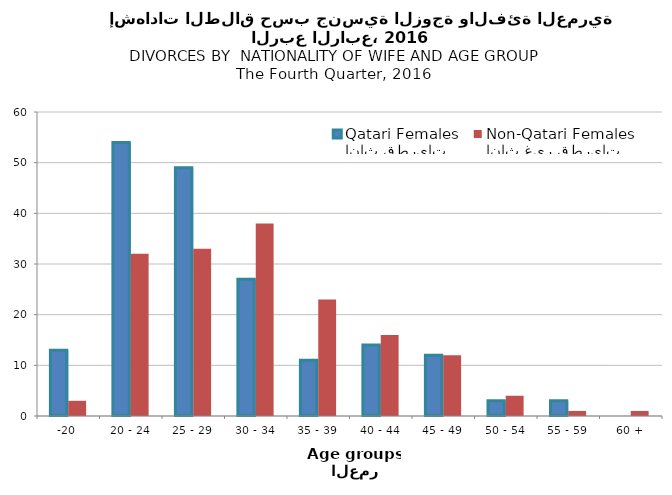
| Category | إناث قطريات
Qatari Females | إناث غير قطريات
Non-Qatari Females |
|---|---|---|
| -20 | 13 | 3 |
| 20 - 24 | 54 | 32 |
| 25 - 29 | 49 | 33 |
| 30 - 34 | 27 | 38 |
| 35 - 39 | 11 | 23 |
| 40 - 44 | 14 | 16 |
| 45 - 49 | 12 | 12 |
| 50 - 54 | 3 | 4 |
| 55 - 59 | 3 | 1 |
| 60 + | 0 | 1 |